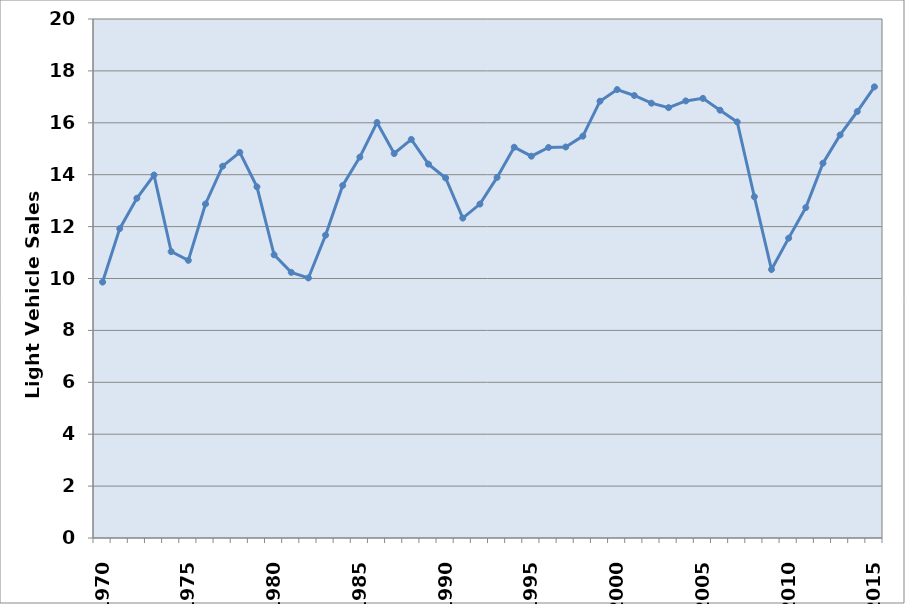
| Category | Series 0 |
|---|---|
| 1970.0 | 9.862 |
| 1971.0 | 11.921 |
| 1972.0 | 13.093 |
| 1973.0 | 13.986 |
| 1974.0 | 11.037 |
| 1975.0 | 10.7 |
| 1976.0 | 12.872 |
| 1977.0 | 14.328 |
| 1978.0 | 14.861 |
| 1979.0 | 13.533 |
| 1980.0 | 10.913 |
| 1981.0 | 10.236 |
| 1982.0 | 10.02 |
| 1983.0 | 11.669 |
| 1984.0 | 13.585 |
| 1985.0 | 14.678 |
| 1986.0 | 16.01 |
| 1987.0 | 14.816 |
| 1988.0 | 15.361 |
| 1989.0 | 14.408 |
| 1990.0 | 13.872 |
| 1991.0 | 12.328 |
| 1992.0 | 12.868 |
| 1993.0 | 13.896 |
| 1994.0 | 15.059 |
| 1995.0 | 14.713 |
| 1996.0 | 15.05 |
| 1997.0 | 15.067 |
| 1998.0 | 15.486 |
| 1999.0 | 16.833 |
| 2000.0 | 17.281 |
| 2001.0 | 17.052 |
| 2002.0 | 16.755 |
| 2003.0 | 16.585 |
| 2004.0 | 16.844 |
| 2005.0 | 16.941 |
| 2006.0 | 16.486 |
| 2007.0 | 16.033 |
| 2008.0 | 13.15 |
| 2009.0 | 10.348 |
| 2010.0 | 11.555 |
| 2011.0 | 12.734 |
| 2012.0 | 14.443 |
| 2013.0 | 15.532 |
| 2014.0 | 16.435 |
| 2015.0 | 17.386 |